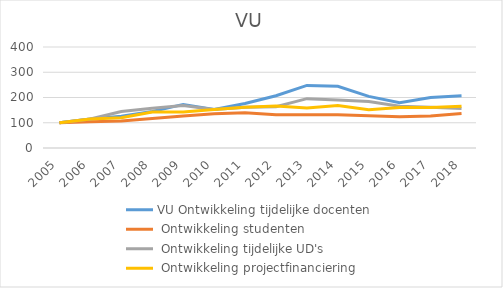
| Category | VU Ontwikkeling tijdelijke docenten | VU Ontwikkeling studenten | VU Ontwikkeling tijdelijke UD's | VU Ontwikkeling projectfinanciering |
|---|---|---|---|---|
| 2005.0 | 100 | 100 | 100 | 100 |
| 2006.0 | 114.53 | 103.727 | 114.943 | 114.867 |
| 2007.0 | 125.641 | 107.225 | 144.828 | 119.469 |
| 2008.0 | 144.444 | 117.06 | 157.471 | 142.478 |
| 2009.0 | 172.65 | 126.894 | 167.816 | 142.655 |
| 2010.0 | 152.991 | 135.66 | 152.874 | 152.035 |
| 2011.0 | 176.068 | 139.393 | 160.92 | 161.062 |
| 2012.0 | 206.838 | 131.21 | 163.218 | 165.841 |
| 2013.0 | 247.863 | 131.539 | 195.402 | 158.442 |
| 2014.0 | 244.444 | 131.666 | 189.655 | 168.412 |
| 2015.0 | 204.274 | 127.506 | 183.908 | 151.947 |
| 2016.0 | 179.487 | 124.107 | 165.517 | 160.476 |
| 2017.0 | 200.068 | 126.699 | 161.586 | 160.83 |
| 2018.0 | 206.838 | 136.65 | 156.69 | 165.719 |